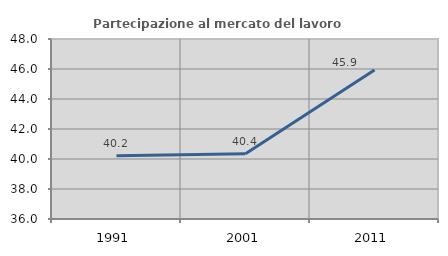
| Category | Partecipazione al mercato del lavoro  femminile |
|---|---|
| 1991.0 | 40.22 |
| 2001.0 | 40.356 |
| 2011.0 | 45.94 |